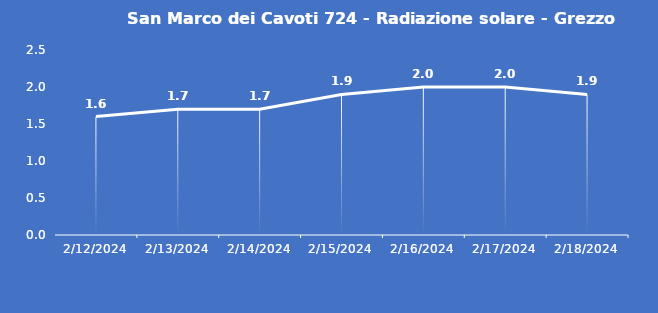
| Category | San Marco dei Cavoti 724 - Radiazione solare - Grezzo (W/m2) |
|---|---|
| 2/12/24 | 1.6 |
| 2/13/24 | 1.7 |
| 2/14/24 | 1.7 |
| 2/15/24 | 1.9 |
| 2/16/24 | 2 |
| 2/17/24 | 2 |
| 2/18/24 | 1.9 |